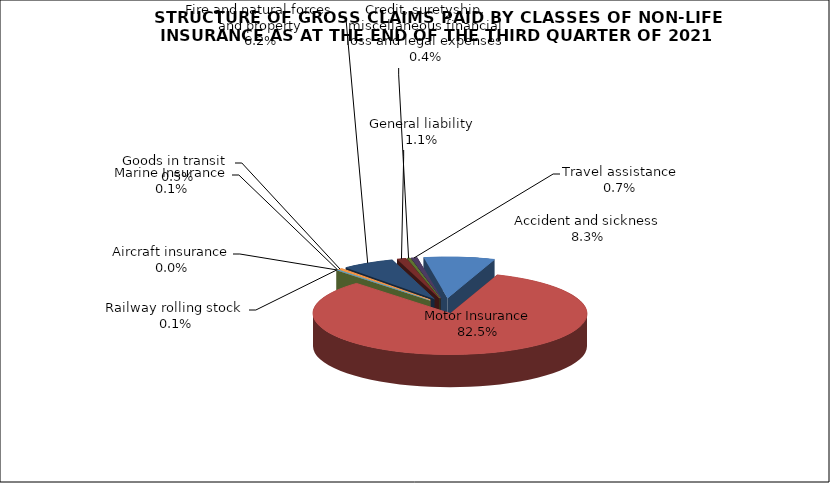
| Category | Accident and sickness |
|---|---|
| Accident and sickness | 0.083 |
| Motor Insurance | 0.825 |
| Railway rolling stock  | 0.001 |
| Aircraft insurance | 0 |
| Marine Insurance | 0.001 |
| Goods in transit  | 0.005 |
| Fire and natural forces and property | 0.062 |
| General liability | 0.011 |
| Credit, suretyship, miscellaneous financial loss and legal expenses | 0.004 |
| Travel assistance | 0.007 |